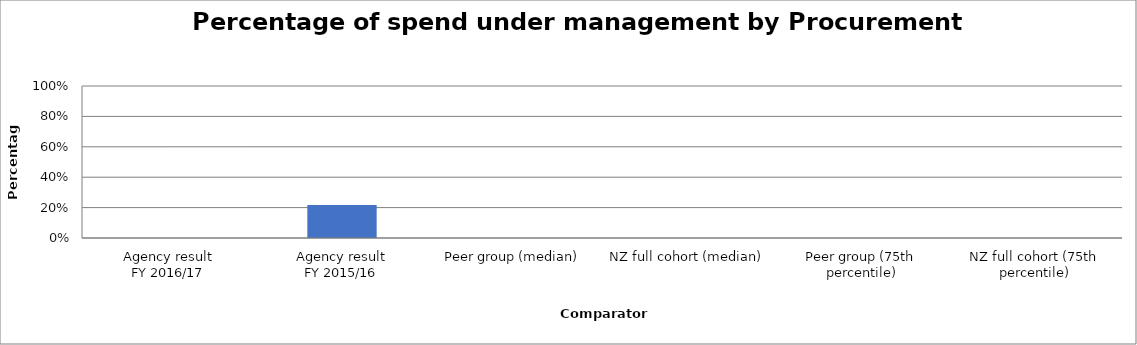
| Category | Series 0 |
|---|---|
| Agency result
FY 2016/17 | 0 |
| Agency result
FY 2015/16 | 0.218 |
| Peer group (median) | 0 |
| NZ full cohort (median) | 0 |
| Peer group (75th percentile) | 0 |
| NZ full cohort (75th percentile) | 0 |